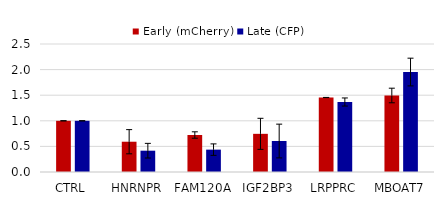
| Category | Early (mCherry) | Late (CFP) |
|---|---|---|
| CTRL | 1 | 1 |
| HNRNPR | 0.591 | 0.416 |
| FAM120A | 0.722 | 0.437 |
| IGF2BP3 | 0.745 | 0.605 |
| LRPPRC | 1.455 | 1.367 |
| MBOAT7 | 1.494 | 1.952 |